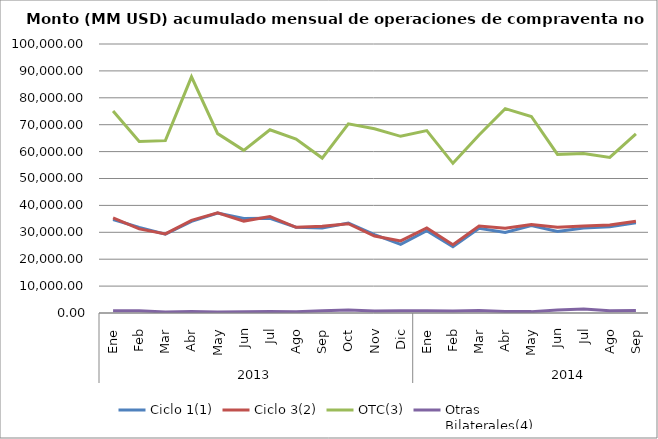
| Category | Ciclo 1(1) | Ciclo 3(2) | OTC(3) | Otras
Bilaterales(4) |
|---|---|---|---|---|
| 0 | 34736.674 | 35336.778 | 75100.994 | 862.558 |
| 1 | 31837.301 | 31276.084 | 63735.014 | 835.426 |
| 2 | 29308.645 | 29417.861 | 64070.642 | 371.583 |
| 3 | 34083.554 | 34428.23 | 87796.406 | 540.738 |
| 4 | 37163.38 | 37242.543 | 66687.424 | 368.797 |
| 5 | 35163.266 | 34165.361 | 60467.987 | 473.52 |
| 6 | 35197.057 | 35828.881 | 68121.887 | 537.978 |
| 7 | 31913.776 | 31846.832 | 64630.867 | 477.656 |
| 8 | 31601.855 | 32260.646 | 57599.123 | 864.94 |
| 9 | 33455.872 | 33201.092 | 70316.044 | 1074.052 |
| 10 | 29141.89 | 28620.849 | 68482.193 | 758.559 |
| 11 | 25532.796 | 26816.016 | 65678.317 | 842.072 |
| 12 | 30609.998 | 31608.391 | 67807.808 | 838.473 |
| 13 | 24661.445 | 25355.64 | 55646.165 | 717.558 |
| 14 | 31490.456 | 32327.003 | 66188.016 | 905.778 |
| 15 | 29968.466 | 31511.409 | 75953.393 | 552.114 |
| 16 | 32511.8 | 32893.552 | 73041.006 | 512.251 |
| 17 | 30347.815 | 31837.962 | 58974.75 | 1157.814 |
| 18 | 31634.299 | 32380.251 | 59280.214 | 1471.651 |
| 19 | 32084.514 | 32686.117 | 57820.266 | 827.326 |
| 20 | 33552.254 | 34123.345 | 66553.88 | 951.31 |